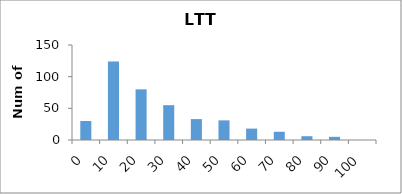
| Category | Series 0 |
|---|---|
| 0.0 | 30 |
| 10.0 | 124 |
| 20.0 | 80 |
| 30.0 | 55 |
| 40.0 | 33 |
| 50.0 | 31 |
| 60.0 | 18 |
| 70.0 | 13 |
| 80.0 | 6 |
| 90.0 | 5 |
| 100.0 | 0 |